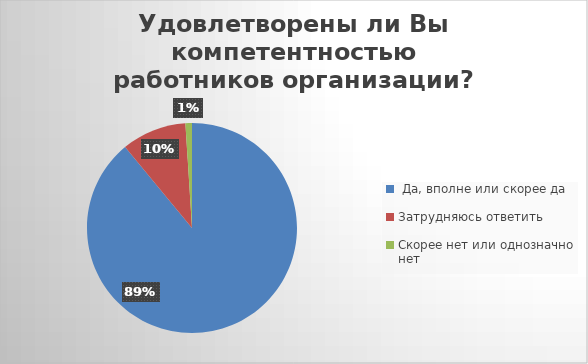
| Category | Series 0 |
|---|---|
|  Да, вполне или скорее да | 0.89 |
| Затрудняюсь ответить | 0.1 |
| Скорее нет или однозначно нет | 0.01 |